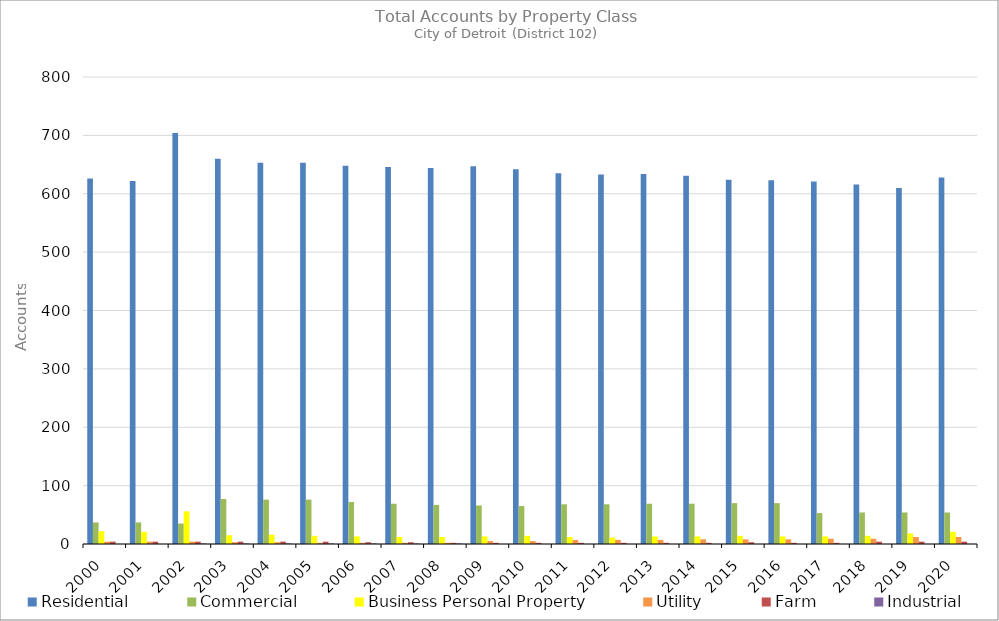
| Category | Residential | Commercial | Business Personal Property | Utility | Farm | Industrial |
|---|---|---|---|---|---|---|
| 2000.0 | 626 | 37 | 22 | 4 | 4 | 0 |
| 2001.0 | 622 | 37 | 21 | 4 | 4 | 0 |
| 2002.0 | 704 | 35 | 56 | 4 | 4 | 1 |
| 2003.0 | 660 | 77 | 15 | 3 | 4 | 1 |
| 2004.0 | 653 | 76 | 16 | 3 | 4 | 1 |
| 2005.0 | 653 | 76 | 14 | 2 | 4 | 1 |
| 2006.0 | 648 | 72 | 13 | 2 | 3 | 1 |
| 2007.0 | 646 | 69 | 12 | 2 | 3 | 1 |
| 2008.0 | 644 | 67 | 12 | 2 | 2 | 1 |
| 2009.0 | 647 | 66 | 13 | 5 | 2 | 0 |
| 2010.0 | 642 | 65 | 14 | 5 | 2 | 0 |
| 2011.0 | 635 | 68 | 12 | 7 | 2 | 0 |
| 2012.0 | 633 | 68 | 11 | 7 | 2 | 0 |
| 2013.0 | 634 | 69 | 13 | 7 | 2 | 0 |
| 2014.0 | 631 | 69 | 13 | 8 | 2 | 0 |
| 2015.0 | 624 | 70 | 14 | 8 | 3 | 0 |
| 2016.0 | 623 | 70 | 13 | 8 | 2 | 0 |
| 2017.0 | 621 | 53 | 13 | 9 | 2 | 0 |
| 2018.0 | 616 | 54 | 14 | 9 | 4 | 0 |
| 2019.0 | 610 | 54 | 18 | 12 | 4 | 0 |
| 2020.0 | 628 | 54 | 21 | 12 | 4 | 0 |